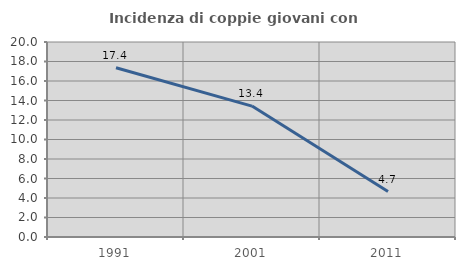
| Category | Incidenza di coppie giovani con figli |
|---|---|
| 1991.0 | 17.363 |
| 2001.0 | 13.426 |
| 2011.0 | 4.658 |